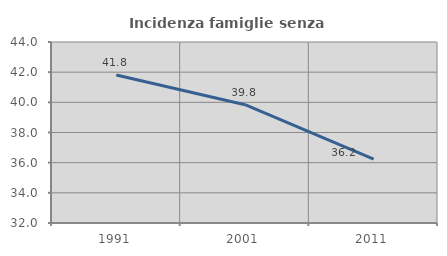
| Category | Incidenza famiglie senza nuclei |
|---|---|
| 1991.0 | 41.813 |
| 2001.0 | 39.843 |
| 2011.0 | 36.237 |